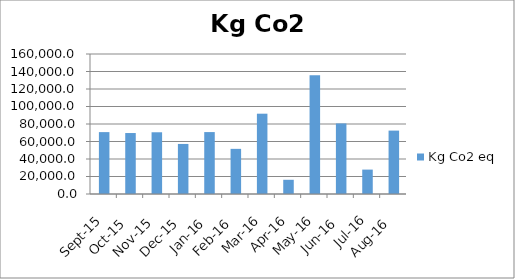
| Category | Kg Co2 eq |
|---|---|
| 2016-08-01 | 72451 |
| 2016-07-01 | 27893.87 |
| 2016-06-01 | 80643.87 |
| 2016-05-01 | 135627.8 |
| 2016-04-01 | 16242.76 |
| 2016-03-01 | 91777.07 |
| 2016-02-01 | 51594.24 |
| 2016-01-01 | 70770.8 |
| 2015-12-01 | 57207.9 |
| 2015-11-01 | 70547.8 |
| 2015-10-01 | 69678.46 |
| 2015-09-01 | 70728.25 |